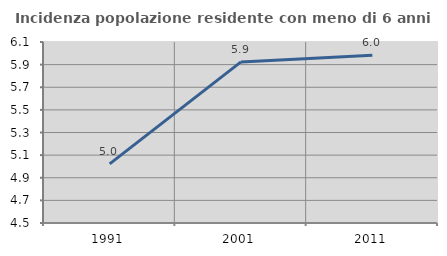
| Category | Incidenza popolazione residente con meno di 6 anni |
|---|---|
| 1991.0 | 5.023 |
| 2001.0 | 5.924 |
| 2011.0 | 5.983 |